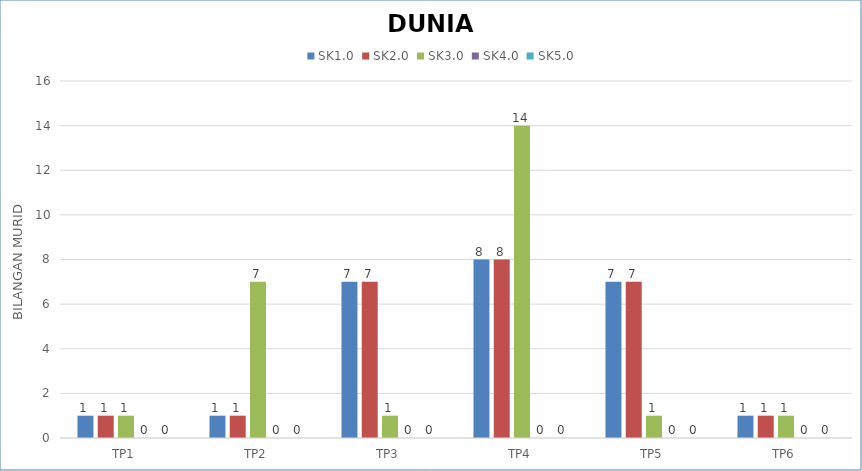
| Category | SK1.0 | SK2.0 | SK3.0 | SK4.0 | SK5.0 |
|---|---|---|---|---|---|
| TP1 | 1 | 1 | 1 | 0 | 0 |
| TP2 | 1 | 1 | 7 | 0 | 0 |
| TP3 | 7 | 7 | 1 | 0 | 0 |
| TP4 | 8 | 8 | 14 | 0 | 0 |
| TP5 | 7 | 7 | 1 | 0 | 0 |
| TP6 | 1 | 1 | 1 | 0 | 0 |